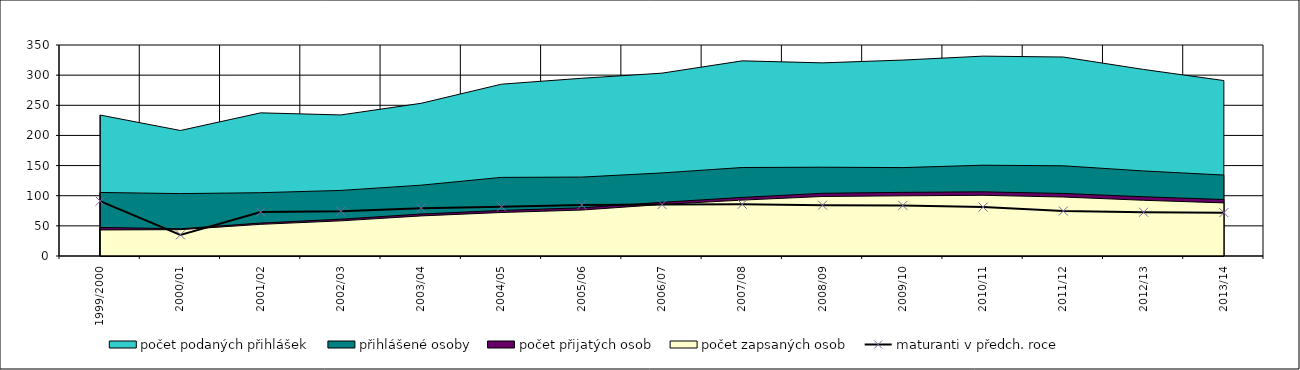
| Category | maturanti v předch. roce  |
|---|---|
| 1999/2000 | 91 |
| 2000/01 | 35.1 |
| 2001/02 | 73.1 |
| 2002/03 | 74.1 |
| 2003/04 | 79.4 |
| 2004/05 | 81.687 |
| 2005/06 | 84.688 |
| 2006/07 | 85.357 |
| 2007/08 | 85.8 |
| 2008/09 | 84.3 |
| 2009/10 | 83.9 |
| 2010/11 | 81.1 |
| 2011/12 | 74.6 |
| 2012/13 | 72.6 |
| 2013/14 | 71.9 |